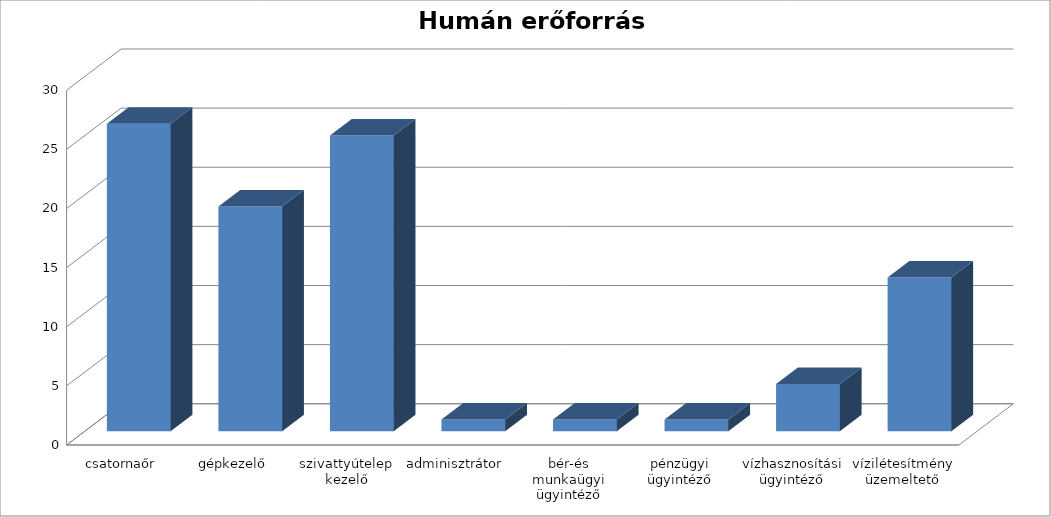
| Category | Series 0 |
|---|---|
| csatornaőr | 26 |
| gépkezelő | 19 |
| szivattyútelep kezelő | 25 |
| adminisztrátor | 1 |
| bér-és munkaügyi ügyintéző | 1 |
| pénzügyi ügyintéző | 1 |
| vízhasznosítási ügyintéző | 4 |
| vízilétesítmény üzemeltető | 13 |